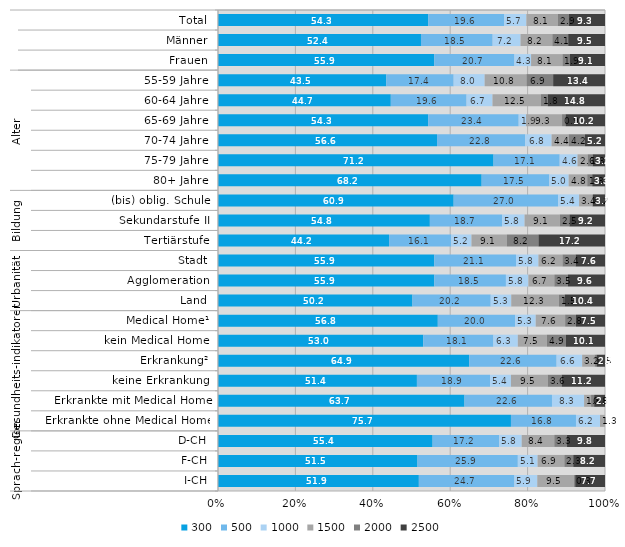
| Category | 300 | 500 | 1000 | 1500 | 2000 | 2500 |
|---|---|---|---|---|---|---|
| 0 | 54.3 | 19.6 | 5.7 | 8.1 | 2.9 | 9.3 |
| 1 | 52.4 | 18.5 | 7.2 | 8.2 | 4.1 | 9.5 |
| 2 | 55.9 | 20.7 | 4.3 | 8.1 | 1.9 | 9.1 |
| 3 | 43.5 | 17.4 | 8 | 10.8 | 6.9 | 13.4 |
| 4 | 44.7 | 19.6 | 6.7 | 12.5 | 1.8 | 14.8 |
| 5 | 54.3 | 23.4 | 1.9 | 9.3 | 0.9 | 10.2 |
| 6 | 56.6 | 22.8 | 6.8 | 4.4 | 4.2 | 5.2 |
| 7 | 71.2 | 17.1 | 4.6 | 2.6 | 1.3 | 3.2 |
| 8 | 68.2 | 17.5 | 5 | 4.8 | 1.3 | 3.3 |
| 9 | 60.9 | 27 | 5.4 | 3.4 | 0.2 | 3.1 |
| 10 | 54.8 | 18.7 | 5.8 | 9.1 | 2.5 | 9.2 |
| 11 | 44.2 | 16.1 | 5.2 | 9.1 | 8.2 | 17.2 |
| 12 | 55.9 | 21.1 | 5.8 | 6.2 | 3.4 | 7.6 |
| 13 | 55.9 | 18.5 | 5.8 | 6.7 | 3.5 | 9.6 |
| 14 | 50.2 | 20.2 | 5.3 | 12.3 | 1.5 | 10.4 |
| 15 | 56.8 | 20 | 5.3 | 7.6 | 2.8 | 7.5 |
| 16 | 53 | 18.1 | 6.3 | 7.5 | 4.9 | 10.1 |
| 17 | 64.9 | 22.6 | 6.6 | 3.2 | 0.5 | 2.2 |
| 18 | 51.4 | 18.9 | 5.4 | 9.5 | 3.6 | 11.2 |
| 19 | 63.7 | 22.6 | 8.3 | 1.8 | 0.8 | 2.8 |
| 20 | 75.7 | 16.8 | 6.2 | 1.3 | 0 | 0 |
| 21 | 55.4 | 17.2 | 5.8 | 8.4 | 3.3 | 9.8 |
| 22 | 51.5 | 25.9 | 5.1 | 6.9 | 2.3 | 8.2 |
| 23 | 51.9 | 24.7 | 5.9 | 9.5 | 0.3 | 7.7 |